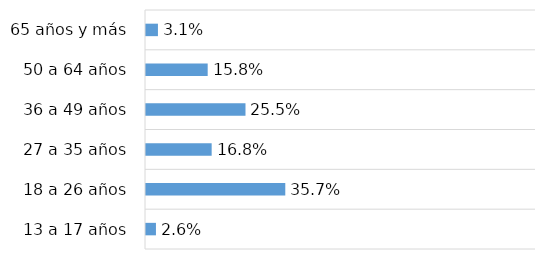
| Category | Series 0 |
|---|---|
| 13 a 17 años | 0.026 |
| 18 a 26 años | 0.357 |
| 27 a 35 años | 0.168 |
| 36 a 49 años | 0.255 |
| 50 a 64 años | 0.158 |
| 65 años y más | 0.031 |